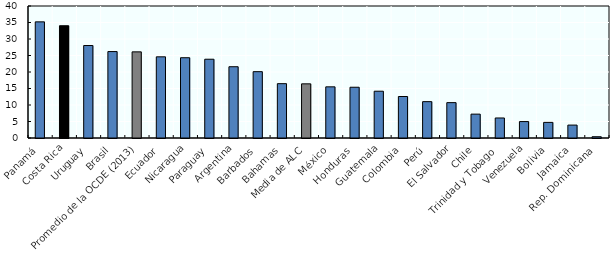
| Category | Series 0 |
|---|---|
| Panamá | 35.193 |
| Costa Rica | 34.023 |
| Uruguay | 28.021 |
| Brasil | 26.192 |
| Promedio de la OCDE (2013) | 26.1 |
| Ecuador | 24.602 |
| Nicaragua | 24.324 |
| Paraguay | 23.872 |
| Argentina | 21.597 |
| Barbados | 20.103 |
| Bahamas | 16.467 |
| Media de ALC | 16.413 |
| México | 15.506 |
| Honduras | 15.379 |
| Guatemala | 14.18 |
| Colombia | 12.575 |
| Perú | 11.015 |
| El Salvador | 10.718 |
| Chile | 7.233 |
| Trinidad y Tobago | 6.068 |
| Venezuela | 4.979 |
| Bolivia | 4.731 |
| Jamaica | 3.912 |
| Rep. Dominicana | 0.385 |